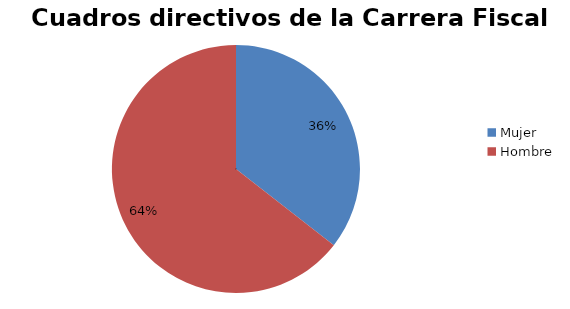
| Category | Series 0 |
|---|---|
| Mujer | 43 |
| Hombre | 78 |